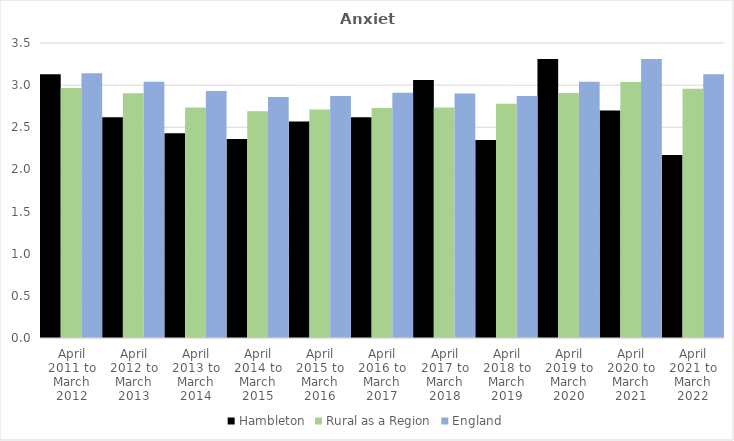
| Category | Hambleton | Rural as a Region | England |
|---|---|---|---|
| April 2011 to March 2012 | 3.13 | 2.967 | 3.14 |
| April 2012 to March 2013 | 2.62 | 2.904 | 3.04 |
| April 2013 to March 2014 | 2.43 | 2.734 | 2.93 |
| April 2014 to March 2015 | 2.36 | 2.691 | 2.86 |
| April 2015 to March 2016 | 2.57 | 2.711 | 2.87 |
| April 2016 to March 2017 | 2.62 | 2.729 | 2.91 |
| April 2017 to March 2018 | 3.06 | 2.736 | 2.9 |
| April 2018 to March 2019 | 2.35 | 2.78 | 2.87 |
| April 2019 to March 2020 | 3.31 | 2.908 | 3.04 |
| April 2020 to March 2021 | 2.7 | 3.036 | 3.31 |
| April 2021 to March 2022 | 2.17 | 2.956 | 3.13 |